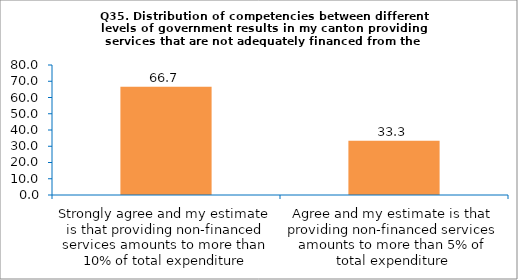
| Category | Series 0 |
|---|---|
| Strongly agree and my estimate is that providing non-financed services amounts to more than 10% of total expenditure | 66.667 |
| Agree and my estimate is that providing non-financed services amounts to more than 5% of total expenditure | 33.333 |